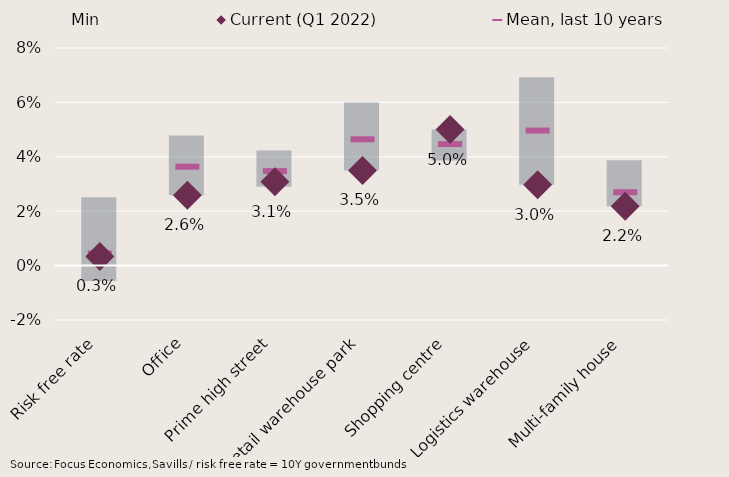
| Category | Min | Range min/max, last 10 years |
|---|---|---|
| Risk free rate | -0.006 | 0.025 |
| Office | 0.026 | 0.022 |
| Prime high street | 0.029 | 0.013 |
| Retail warehouse park | 0.035 | 0.025 |
| Shopping centre | 0.039 | 0.011 |
| Logistics warehouse | 0.03 | 0.04 |
| Multi-family house | 0.022 | 0.017 |